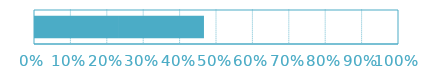
| Category | Series 0 | Series 1 | Series 2 | Series 3 | Series 4 | Series 5 | Series 6 | Series 7 | Series 8 | Series 9 | Series 10 | Series 11 | Series 12 | Series 13 | Series 14 | Series 15 | Series 16 | Series 17 | Series 18 | Series 19 | Series 20 | Series 21 | Series 22 | Series 23 | Series 24 | Series 25 | Series 26 | Series 27 | Series 28 | Series 29 |
|---|---|---|---|---|---|---|---|---|---|---|---|---|---|---|---|---|---|---|---|---|---|---|---|---|---|---|---|---|---|---|
| 0 | 0.233 | 0 | 0.233 | 0 | 0 | 0 | 0 | 0 | 0 | 0 | 0 | 0 | 0 | 0 | 0 | 0 | 0 | 0 | 0 | 0 | 0 | 0 | 0 | 0 | 0 | 0 | 0 | 0 | 0 | 0 |